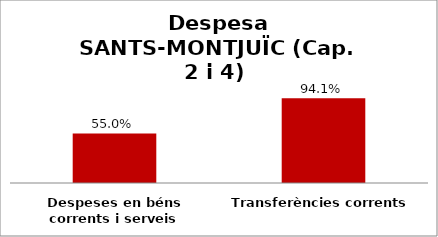
| Category | Series 0 |
|---|---|
| Despeses en béns corrents i serveis | 0.55 |
| Transferències corrents | 0.941 |